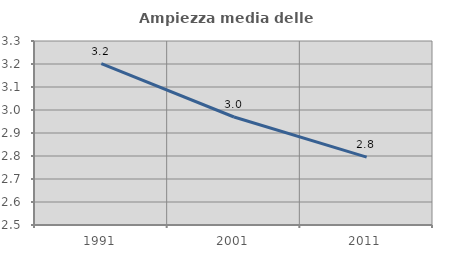
| Category | Ampiezza media delle famiglie |
|---|---|
| 1991.0 | 3.201 |
| 2001.0 | 2.97 |
| 2011.0 | 2.795 |